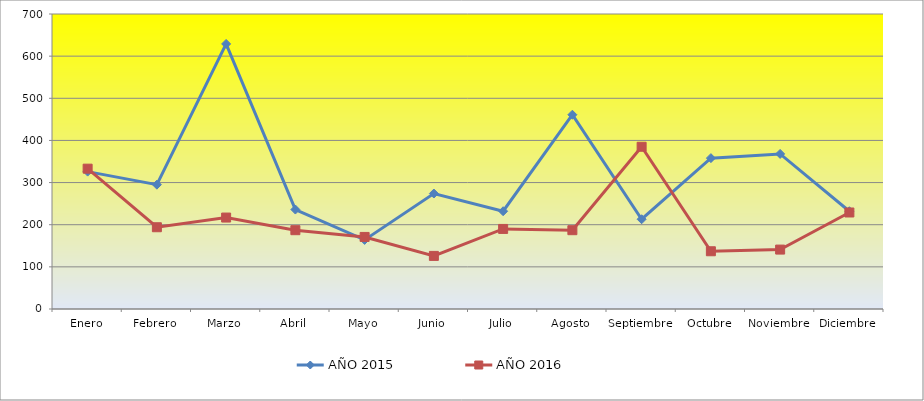
| Category | AÑO 2015 | AÑO 2016 |
|---|---|---|
| Enero | 326 | 333 |
| Febrero | 295 | 194 |
| Marzo | 629 | 217 |
| Abril | 236 | 187 |
| Mayo | 164 | 171 |
| Junio | 274 | 126 |
| Julio | 232 | 190 |
| Agosto | 461 | 187 |
| Septiembre | 213 | 385 |
| Octubre | 358 | 137 |
| Noviembre | 368 | 141 |
| Diciembre | 232 | 229 |